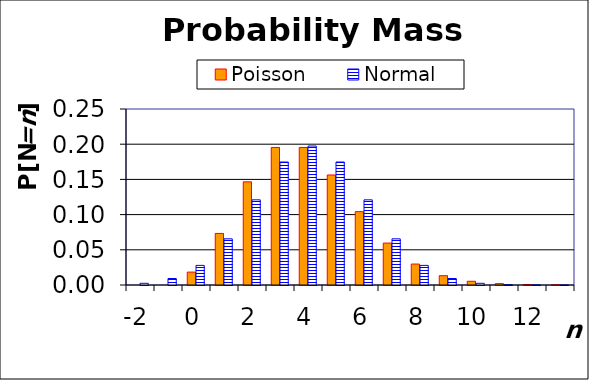
| Category | Poisson | Normal |
|---|---|---|
| -2.0 | 0 | 0.002 |
| -1.0 | 0 | 0.009 |
| 0.0 | 0.018 | 0.028 |
| 1.0 | 0.073 | 0.066 |
| 2.0 | 0.147 | 0.121 |
| 3.0 | 0.195 | 0.175 |
| 4.0 | 0.195 | 0.197 |
| 5.0 | 0.156 | 0.175 |
| 6.0 | 0.104 | 0.121 |
| 7.0 | 0.06 | 0.066 |
| 8.0 | 0.03 | 0.028 |
| 9.0 | 0.013 | 0.009 |
| 10.0 | 0.005 | 0.002 |
| 11.0 | 0.002 | 0 |
| 12.0 | 0.001 | 0 |
| 13.0 | 0 | 0 |